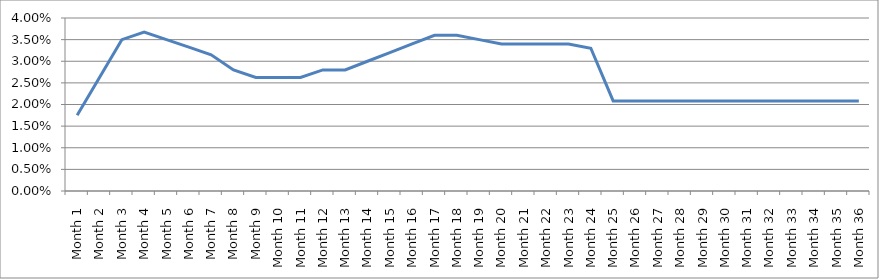
| Category | Series 0 |
|---|---|
| Month 1 | 0.017 |
| Month 2 | 0.026 |
| Month 3 | 0.035 |
| Month 4 | 0.037 |
| Month 5 | 0.035 |
| Month 6 | 0.033 |
| Month 7 | 0.032 |
| Month 8 | 0.028 |
| Month 9 | 0.026 |
| Month 10 | 0.026 |
| Month 11 | 0.026 |
| Month 12 | 0.028 |
| Month 13 | 0.028 |
| Month 14 | 0.03 |
| Month 15 | 0.032 |
| Month 16 | 0.034 |
| Month 17 | 0.036 |
| Month 18 | 0.036 |
| Month 19 | 0.035 |
| Month 20 | 0.034 |
| Month 21 | 0.034 |
| Month 22 | 0.034 |
| Month 23 | 0.034 |
| Month 24 | 0.033 |
| Month 25 | 0.021 |
| Month 26 | 0.021 |
| Month 27 | 0.021 |
| Month 28 | 0.021 |
| Month 29 | 0.021 |
| Month 30 | 0.021 |
| Month 31 | 0.021 |
| Month 32 | 0.021 |
| Month 33 | 0.021 |
| Month 34 | 0.021 |
| Month 35 | 0.021 |
| Month 36 | 0.021 |